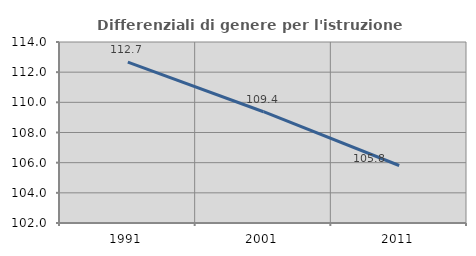
| Category | Differenziali di genere per l'istruzione superiore |
|---|---|
| 1991.0 | 112.671 |
| 2001.0 | 109.378 |
| 2011.0 | 105.811 |